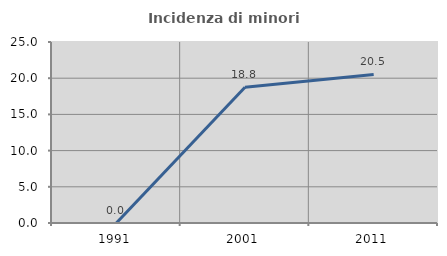
| Category | Incidenza di minori stranieri |
|---|---|
| 1991.0 | 0 |
| 2001.0 | 18.75 |
| 2011.0 | 20.513 |